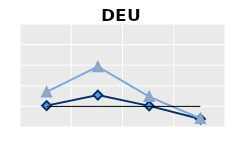
| Category | Public goods | Individual items only | Series 1 |
|---|---|---|---|
| 15-24 | 1.038 | 1.704 | 1 |
| 25-54 | 1.551 | 2.926 | 1 |
| 55-64 | 1.026 | 1.477 | 1 |
| 65+ | 0.388 | 0.411 | 1 |